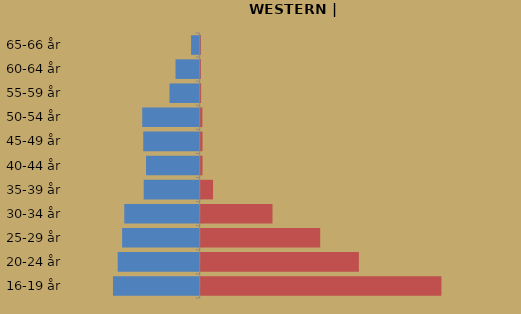
| Category | % Efterkommere fra ikke-vestlige lande |
|---|---|
| 16-19 år | 0.396 |
| 20-24 år | 0.26 |
| 25-29 år | 0.196 |
| 30-34 år | 0.118 |
| 35-39 år | 0.02 |
| 40-44 år | 0.003 |
| 45-49 år | 0.003 |
| 50-54 år | 0.003 |
| 55-59 år | 0.001 |
| 60-64 år | 0 |
| 65-66 år | 0 |